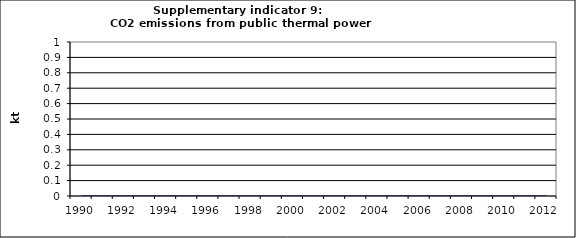
| Category | CO2 emissions from public thermal power stations, kt |
|---|---|
| 1990 | 0 |
| 1991 | 0 |
| 1992 | 0 |
| 1993 | 0 |
| 1994 | 0 |
| 1995 | 0 |
| 1996 | 0 |
| 1997 | 0 |
| 1998 | 0 |
| 1999 | 0 |
| 2000 | 0 |
| 2001 | 0 |
| 2002 | 0 |
| 2003 | 0 |
| 2004 | 0 |
| 2005 | 0 |
| 2006 | 0 |
| 2007 | 0 |
| 2008 | 0 |
| 2009 | 0 |
| 2010 | 0 |
| 2011 | 0 |
| 2012 | 0 |